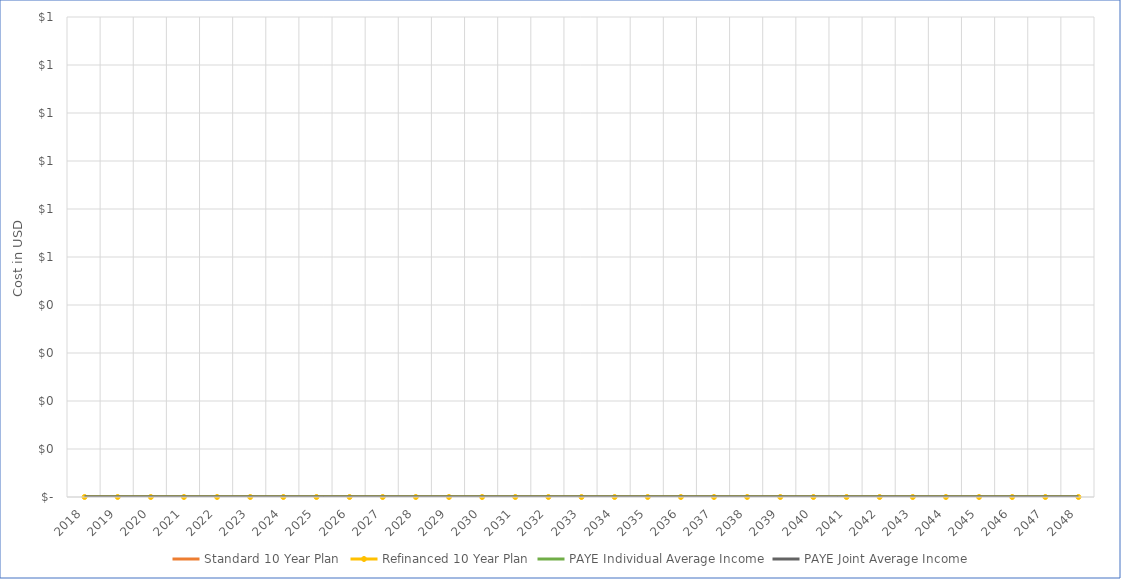
| Category | Standard 10 Year Plan  | Modified 6 Year Plan | Modified 20 Year Plan | Refinanced 10 Year Plan | PAYE Individual Low Income | PAYE Individual Average Income | PAYE Individual High Income | PAYE Joint Low Income | PAYE Joint Average Income | PAYE Joint High Income | REPAYE  Low Income | REPAYE  Average Income | REPAYE  High Income | IBR Individual Low Income | IBR Individual Average Income | IBR Individual High Income | IBR Joint Low Income | IBR Joint Average Income | IBR Joint High Income | ICR Individual Low Income | ICR Individual Average Income | ICR Individual High Income | ICR Joint Low Income | ICR Joint Average Income | ICR Joint High Income | PAYE Individual Low Income with PSLF | PAYE Individual Average Income with PSLF | PAYE Individual High Income with PSLF | PAYE Joint Low Income with PSLF | PAYE Joint Average Income with PSLF | PAYE Joint High Income with PSLF | REPAYE  Low Income with PSLF | REPAYE  Average Income with PSLF | REPAYE  High Income with PSLF | IBR Individual Low Income with PSLF | IBR Individual Average Income with PSLF | IBR Individual High Income with PSLF | IBR Joint Low Income with PSLF | IBR Joint Average Income with PSLF | IBR Joint High Income with PSLF | ICR Individual Low Income with PSLF | ICR Individual Average Income with PSLF | ICR Individual High Income with PSLF | ICR Joint Low Income with PSLF | ICR Joint Average Income with PSLF | ICR Joint High Income with PSLF | Individual Average Income | Individual High Income | Joint Low Income | Joint Average Income | Joint High Income | Individual Low Income |
|---|---|---|---|---|---|---|---|---|---|---|---|---|---|---|---|---|---|---|---|---|---|---|---|---|---|---|---|---|---|---|---|---|---|---|---|---|---|---|---|---|---|---|---|---|---|---|---|---|---|---|---|---|
| 2018.0 | 0 |  |  | 0 |  | 0 |  |  | 0 |  |  |  |  |  |  |  |  |  |  |  |  |  |  |  |  |  |  |  |  |  |  |  |  |  |  |  |  |  |  |  |  |  |  |  |  |  |  |  |  |  |  |  |
| 2019.0 | 0 |  |  | 0 |  | 0 |  |  | 0 |  |  |  |  |  |  |  |  |  |  |  |  |  |  |  |  |  |  |  |  |  |  |  |  |  |  |  |  |  |  |  |  |  |  |  |  |  |  |  |  |  |  |  |
| 2020.0 | 0 |  |  | 0 |  | 0 |  |  | 0 |  |  |  |  |  |  |  |  |  |  |  |  |  |  |  |  |  |  |  |  |  |  |  |  |  |  |  |  |  |  |  |  |  |  |  |  |  |  |  |  |  |  |  |
| 2021.0 | 0 |  |  | 0 |  | 0 |  |  | 0 |  |  |  |  |  |  |  |  |  |  |  |  |  |  |  |  |  |  |  |  |  |  |  |  |  |  |  |  |  |  |  |  |  |  |  |  |  |  |  |  |  |  |  |
| 2022.0 | 0 |  |  | 0 |  | 0 |  |  | 0 |  |  |  |  |  |  |  |  |  |  |  |  |  |  |  |  |  |  |  |  |  |  |  |  |  |  |  |  |  |  |  |  |  |  |  |  |  |  |  |  |  |  |  |
| 2023.0 | 0 |  |  | 0 |  | 0 |  |  | 0 |  |  |  |  |  |  |  |  |  |  |  |  |  |  |  |  |  |  |  |  |  |  |  |  |  |  |  |  |  |  |  |  |  |  |  |  |  |  |  |  |  |  |  |
| 2024.0 | 0 |  |  | 0 |  | 0 |  |  | 0 |  |  |  |  |  |  |  |  |  |  |  |  |  |  |  |  |  |  |  |  |  |  |  |  |  |  |  |  |  |  |  |  |  |  |  |  |  |  |  |  |  |  |  |
| 2025.0 | 0 |  |  | 0 |  | 0 |  |  | 0 |  |  |  |  |  |  |  |  |  |  |  |  |  |  |  |  |  |  |  |  |  |  |  |  |  |  |  |  |  |  |  |  |  |  |  |  |  |  |  |  |  |  |  |
| 2026.0 | 0 |  |  | 0 |  | 0 |  |  | 0 |  |  |  |  |  |  |  |  |  |  |  |  |  |  |  |  |  |  |  |  |  |  |  |  |  |  |  |  |  |  |  |  |  |  |  |  |  |  |  |  |  |  |  |
| 2027.0 | 0 |  |  | 0 |  | 0 |  |  | 0 |  |  |  |  |  |  |  |  |  |  |  |  |  |  |  |  |  |  |  |  |  |  |  |  |  |  |  |  |  |  |  |  |  |  |  |  |  |  |  |  |  |  |  |
| 2028.0 | 0 |  |  | 0 |  | 0 |  |  | 0 |  |  |  |  |  |  |  |  |  |  |  |  |  |  |  |  |  |  |  |  |  |  |  |  |  |  |  |  |  |  |  |  |  |  |  |  |  |  |  |  |  |  |  |
| 2029.0 | 0 |  |  | 0 |  | 0 |  |  | 0 |  |  |  |  |  |  |  |  |  |  |  |  |  |  |  |  |  |  |  |  |  |  |  |  |  |  |  |  |  |  |  |  |  |  |  |  |  |  |  |  |  |  |  |
| 2030.0 | 0 |  |  | 0 |  | 0 |  |  | 0 |  |  |  |  |  |  |  |  |  |  |  |  |  |  |  |  |  |  |  |  |  |  |  |  |  |  |  |  |  |  |  |  |  |  |  |  |  |  |  |  |  |  |  |
| 2031.0 | 0 |  |  | 0 |  | 0 |  |  | 0 |  |  |  |  |  |  |  |  |  |  |  |  |  |  |  |  |  |  |  |  |  |  |  |  |  |  |  |  |  |  |  |  |  |  |  |  |  |  |  |  |  |  |  |
| 2032.0 | 0 |  |  | 0 |  | 0 |  |  | 0 |  |  |  |  |  |  |  |  |  |  |  |  |  |  |  |  |  |  |  |  |  |  |  |  |  |  |  |  |  |  |  |  |  |  |  |  |  |  |  |  |  |  |  |
| 2033.0 | 0 |  |  | 0 |  | 0 |  |  | 0 |  |  |  |  |  |  |  |  |  |  |  |  |  |  |  |  |  |  |  |  |  |  |  |  |  |  |  |  |  |  |  |  |  |  |  |  |  |  |  |  |  |  |  |
| 2034.0 | 0 |  |  | 0 |  | 0 |  |  | 0 |  |  |  |  |  |  |  |  |  |  |  |  |  |  |  |  |  |  |  |  |  |  |  |  |  |  |  |  |  |  |  |  |  |  |  |  |  |  |  |  |  |  |  |
| 2035.0 | 0 |  |  | 0 |  | 0 |  |  | 0 |  |  |  |  |  |  |  |  |  |  |  |  |  |  |  |  |  |  |  |  |  |  |  |  |  |  |  |  |  |  |  |  |  |  |  |  |  |  |  |  |  |  |  |
| 2036.0 | 0 |  |  | 0 |  | 0 |  |  | 0 |  |  |  |  |  |  |  |  |  |  |  |  |  |  |  |  |  |  |  |  |  |  |  |  |  |  |  |  |  |  |  |  |  |  |  |  |  |  |  |  |  |  |  |
| 2037.0 | 0 |  |  | 0 |  | 0 |  |  | 0 |  |  |  |  |  |  |  |  |  |  |  |  |  |  |  |  |  |  |  |  |  |  |  |  |  |  |  |  |  |  |  |  |  |  |  |  |  |  |  |  |  |  |  |
| 2038.0 | 0 |  |  | 0 |  | 0 |  |  | 0 |  |  |  |  |  |  |  |  |  |  |  |  |  |  |  |  |  |  |  |  |  |  |  |  |  |  |  |  |  |  |  |  |  |  |  |  |  |  |  |  |  |  |  |
| 2039.0 | 0 |  |  | 0 |  | 0 |  |  | 0 |  |  |  |  |  |  |  |  |  |  |  |  |  |  |  |  |  |  |  |  |  |  |  |  |  |  |  |  |  |  |  |  |  |  |  |  |  |  |  |  |  |  |  |
| 2040.0 | 0 |  |  | 0 |  | 0 |  |  | 0 |  |  |  |  |  |  |  |  |  |  |  |  |  |  |  |  |  |  |  |  |  |  |  |  |  |  |  |  |  |  |  |  |  |  |  |  |  |  |  |  |  |  |  |
| 2041.0 | 0 |  |  | 0 |  | 0 |  |  | 0 |  |  |  |  |  |  |  |  |  |  |  |  |  |  |  |  |  |  |  |  |  |  |  |  |  |  |  |  |  |  |  |  |  |  |  |  |  |  |  |  |  |  |  |
| 2042.0 | 0 |  |  | 0 |  | 0 |  |  | 0 |  |  |  |  |  |  |  |  |  |  |  |  |  |  |  |  |  |  |  |  |  |  |  |  |  |  |  |  |  |  |  |  |  |  |  |  |  |  |  |  |  |  |  |
| 2043.0 | 0 |  |  | 0 |  | 0 |  |  | 0 |  |  |  |  |  |  |  |  |  |  |  |  |  |  |  |  |  |  |  |  |  |  |  |  |  |  |  |  |  |  |  |  |  |  |  |  |  |  |  |  |  |  |  |
| 2044.0 | 0 |  |  | 0 |  | 0 |  |  | 0 |  |  |  |  |  |  |  |  |  |  |  |  |  |  |  |  |  |  |  |  |  |  |  |  |  |  |  |  |  |  |  |  |  |  |  |  |  |  |  |  |  |  |  |
| 2045.0 | 0 |  |  | 0 |  | 0 |  |  | 0 |  |  |  |  |  |  |  |  |  |  |  |  |  |  |  |  |  |  |  |  |  |  |  |  |  |  |  |  |  |  |  |  |  |  |  |  |  |  |  |  |  |  |  |
| 2046.0 | 0 |  |  | 0 |  | 0 |  |  | 0 |  |  |  |  |  |  |  |  |  |  |  |  |  |  |  |  |  |  |  |  |  |  |  |  |  |  |  |  |  |  |  |  |  |  |  |  |  |  |  |  |  |  |  |
| 2047.0 | 0 |  |  | 0 |  | 0 |  |  | 0 |  |  |  |  |  |  |  |  |  |  |  |  |  |  |  |  |  |  |  |  |  |  |  |  |  |  |  |  |  |  |  |  |  |  |  |  |  |  |  |  |  |  |  |
| 2048.0 | 0 |  |  | 0 |  | 0 |  |  | 0 |  |  |  |  |  |  |  |  |  |  |  |  |  |  |  |  |  |  |  |  |  |  |  |  |  |  |  |  |  |  |  |  |  |  |  |  |  |  |  |  |  |  |  |